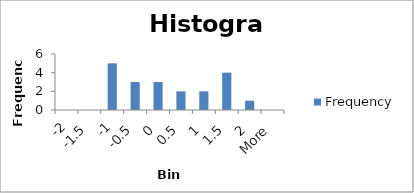
| Category | Frequency |
|---|---|
| -2 | 0 |
| -1.5 | 0 |
| -1 | 5 |
| -0.5 | 3 |
| 0 | 3 |
| 0.5 | 2 |
| 1 | 2 |
| 1.5 | 4 |
| 2 | 1 |
| More | 0 |